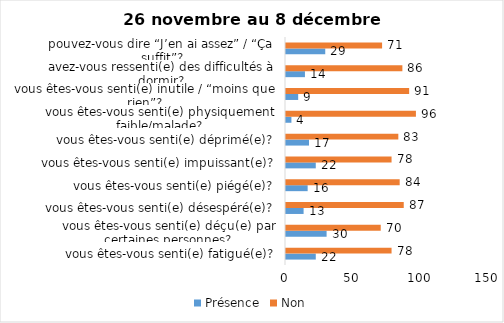
| Category | Présence | Non |
|---|---|---|
| vous êtes-vous senti(e) fatigué(e)? | 22 | 78 |
| vous êtes-vous senti(e) déçu(e) par certaines personnes? | 30 | 70 |
| vous êtes-vous senti(e) désespéré(e)? | 13 | 87 |
| vous êtes-vous senti(e) piégé(e)? | 16 | 84 |
| vous êtes-vous senti(e) impuissant(e)? | 22 | 78 |
| vous êtes-vous senti(e) déprimé(e)? | 17 | 83 |
| vous êtes-vous senti(e) physiquement faible/malade? | 4 | 96 |
| vous êtes-vous senti(e) inutile / “moins que rien”? | 9 | 91 |
| avez-vous ressenti(e) des difficultés à dormir? | 14 | 86 |
| pouvez-vous dire “J’en ai assez” / “Ça suffit”? | 29 | 71 |